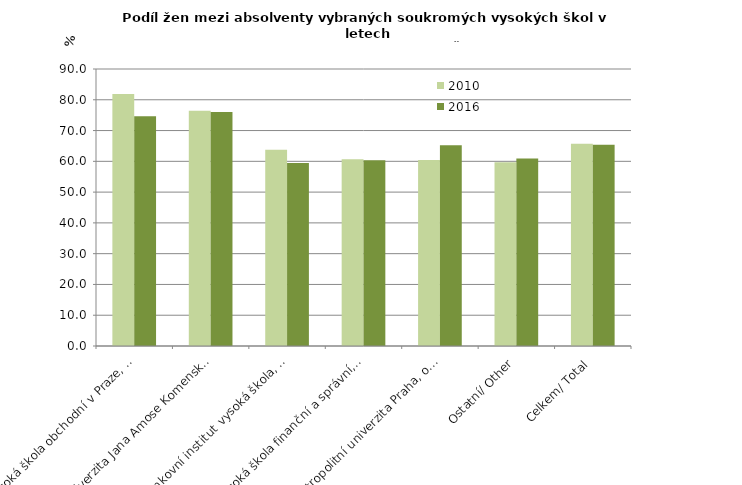
| Category | 2010 | 2016 |
|---|---|---|
| Vysoká škola obchodní v Praze, o.p.s. | 81.881 | 74.679 |
| Univerzita Jana Amose Komenského Praha s.r.o. | 76.432 | 76.061 |
| Bankovní institut vysoká škola, a.s. | 63.8 | 59.437 |
| Vysoká škola finanční a správní, o.p.s. | 60.65 | 60.357 |
| Metropolitní univerzita Praha, o.p.s. | 60.44 | 65.214 |
| Ostatní/ Other | 59.667 | 60.906 |
| Celkem/ Total | 65.746 | 65.359 |